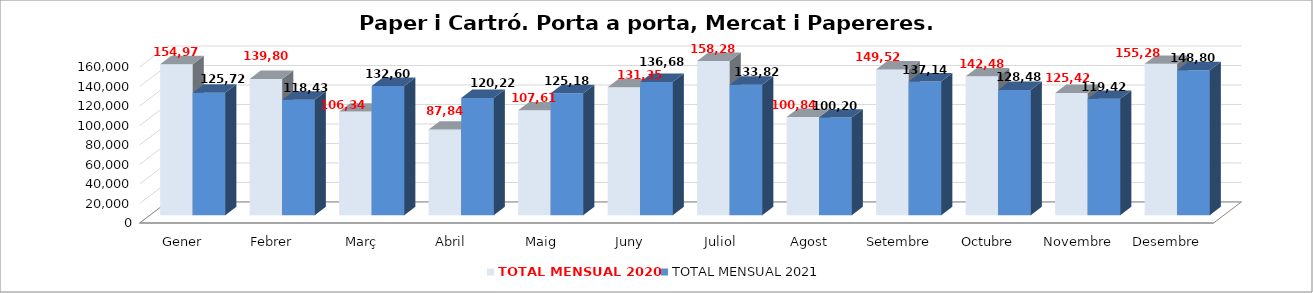
| Category | TOTAL MENSUAL 2020 | TOTAL MENSUAL 2021 |
|---|---|---|
| Gener | 154976 | 125720 |
| Febrer | 139800 | 118430 |
| Març | 106340 | 132600 |
| Abril | 87840 | 120220 |
| Maig | 107610 | 125180 |
| Juny | 131351.43 | 136680 |
| Juliol | 158280 | 133820 |
| Agost | 100841 | 100200 |
| Setembre | 149520 | 137147.37 |
| Octubre | 142480 | 128480 |
| Novembre | 125420 | 119420 |
| Desembre | 155280 | 148800 |